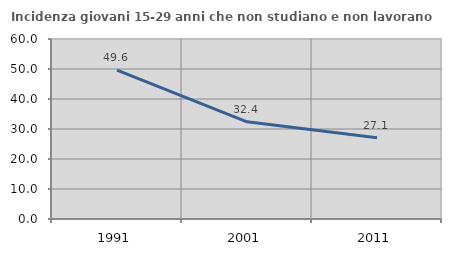
| Category | Incidenza giovani 15-29 anni che non studiano e non lavorano  |
|---|---|
| 1991.0 | 49.611 |
| 2001.0 | 32.394 |
| 2011.0 | 27.053 |